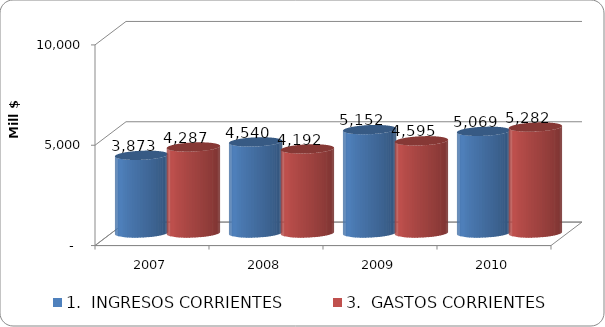
| Category | 1.  INGRESOS CORRIENTES | 3.  GASTOS CORRIENTES |
|---|---|---|
| 2007 | 3873.27 | 4287.389 |
| 2008 | 4539.804 | 4191.507 |
| 2009 | 5151.755 | 4595.293 |
| 2010 | 5068.756 | 5282.228 |